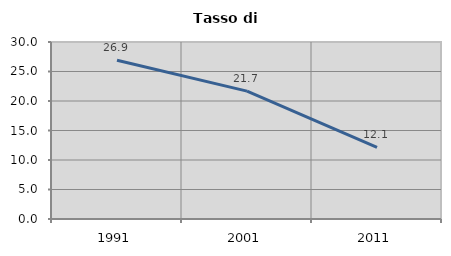
| Category | Tasso di disoccupazione   |
|---|---|
| 1991.0 | 26.897 |
| 2001.0 | 21.678 |
| 2011.0 | 12.121 |